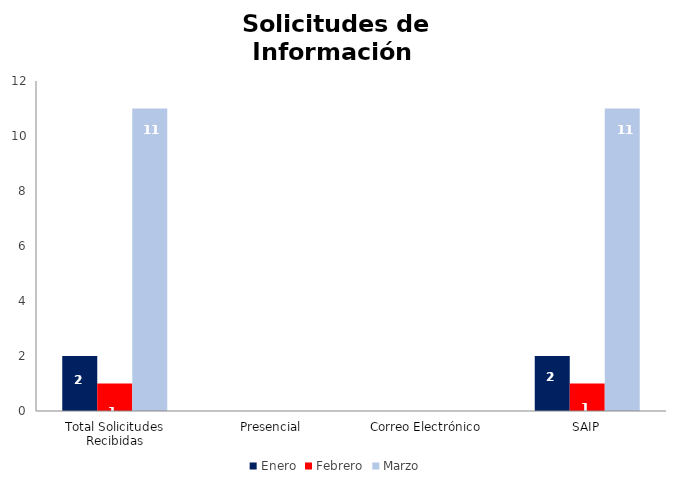
| Category | Enero | Febrero | Marzo |
|---|---|---|---|
| Total Solicitudes Recibidas | 2 | 1 | 11 |
| Presencial | 0 | 0 | 0 |
| Correo Electrónico  | 0 | 0 | 0 |
| SAIP | 2 | 1 | 11 |